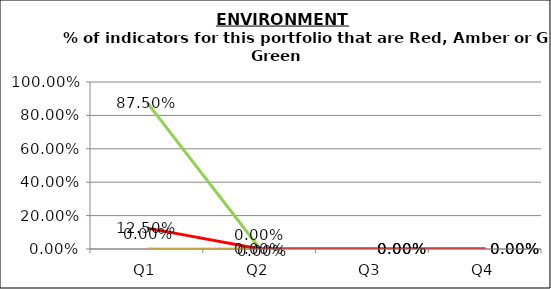
| Category | Green | Amber | Red |
|---|---|---|---|
| Q1 | 0.875 | 0 | 0.125 |
| Q2 | 0 | 0 | 0 |
| Q3 | 0 | 0 | 0 |
| Q4 | 0 | 0 | 0 |